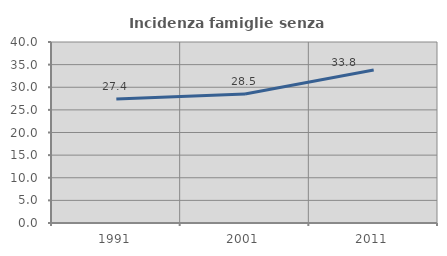
| Category | Incidenza famiglie senza nuclei |
|---|---|
| 1991.0 | 27.428 |
| 2001.0 | 28.512 |
| 2011.0 | 33.816 |